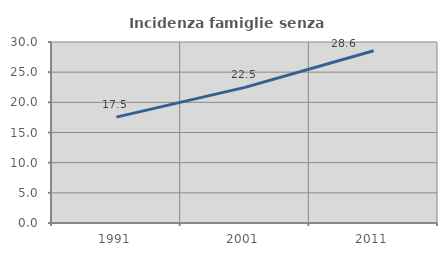
| Category | Incidenza famiglie senza nuclei |
|---|---|
| 1991.0 | 17.544 |
| 2001.0 | 22.481 |
| 2011.0 | 28.553 |